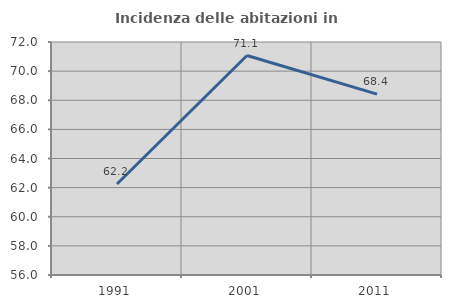
| Category | Incidenza delle abitazioni in proprietà  |
|---|---|
| 1991.0 | 62.249 |
| 2001.0 | 71.071 |
| 2011.0 | 68.421 |